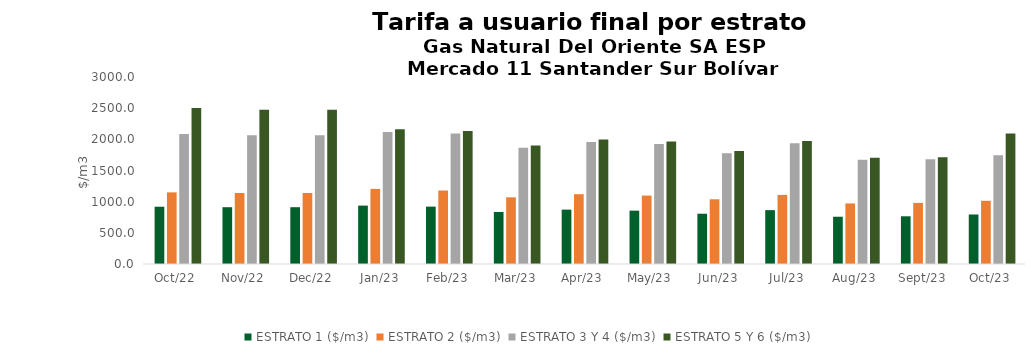
| Category | ESTRATO 1 ($/m3) | ESTRATO 2 ($/m3) | ESTRATO 3 Y 4 ($/m3) | ESTRATO 5 Y 6 ($/m3) |
|---|---|---|---|---|
| 2022-10-01 | 918.84 | 1148.91 | 2085 | 2502 |
| 2022-11-01 | 911.27 | 1139.55 | 2063.64 | 2476.368 |
| 2022-12-01 | 911.27 | 1139.55 | 2063.64 | 2476.368 |
| 2023-01-01 | 936.76 | 1204.6 | 2117.59 | 2159.942 |
| 2023-02-01 | 920.36 | 1179.08 | 2091.73 | 2133.565 |
| 2023-03-01 | 834.84 | 1069.75 | 1864.96 | 1902.259 |
| 2023-04-01 | 872.23 | 1119.98 | 1956.98 | 1996.12 |
| 2023-05-01 | 856.04 | 1097.58 | 1926.46 | 1964.989 |
| 2023-06-01 | 806.28 | 1038.3 | 1778.05 | 1813.611 |
| 2023-07-01 | 864.11 | 1108.42 | 1935.47 | 1974.179 |
| 2023-08-01 | 758.17 | 971.8 | 1672.03 | 1705.471 |
| 2023-09-01 | 765.41 | 980.53 | 1679.03 | 1712.611 |
| 2023-10-01 | 794.12 | 1014.06 | 1746.12 | 2095.344 |